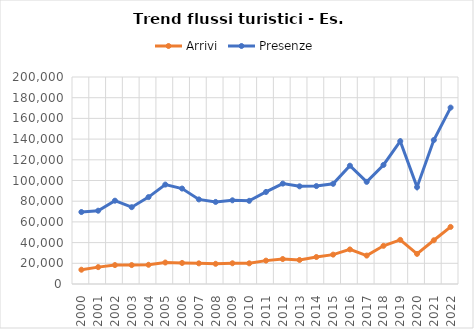
| Category | Arrivi | Presenze |
|---|---|---|
| 2000.0 | 13791 | 69545 |
| 2001.0 | 16302 | 70815 |
| 2002.0 | 18296 | 80494 |
| 2003.0 | 18276 | 74238 |
| 2004.0 | 18558 | 83971 |
| 2005.0 | 20749 | 96050 |
| 2006.0 | 20329 | 92213 |
| 2007.0 | 19951 | 81725 |
| 2008.0 | 19510 | 79300 |
| 2009.0 | 20021 | 80863 |
| 2010.0 | 19975 | 80372 |
| 2011.0 | 22583 | 88937 |
| 2012.0 | 24120 | 97003 |
| 2013.0 | 23216 | 94367 |
| 2014.0 | 26078 | 94612 |
| 2015.0 | 28378 | 96786 |
| 2016.0 | 33397 | 114312 |
| 2017.0 | 27466 | 98682 |
| 2018.0 | 36888 | 115032 |
| 2019.0 | 42633 | 138048 |
| 2020.0 | 29106 | 93594 |
| 2021.0 | 42240 | 139070 |
| 2022.0 | 55151 | 170444 |